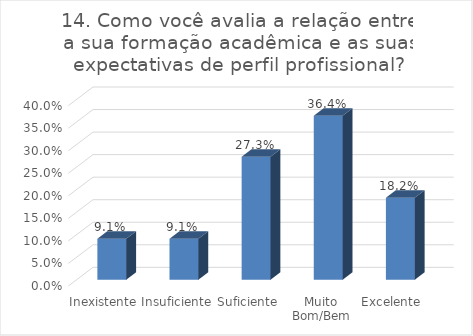
| Category | 14. Como você avalia a relação entre a sua formação acadêmica e as suas expectativas de perfil profissional? |
|---|---|
| Inexistente | 0.091 |
| Insuficiente | 0.091 |
| Suficiente | 0.273 |
| Muito Bom/Bem | 0.364 |
| Excelente | 0.182 |